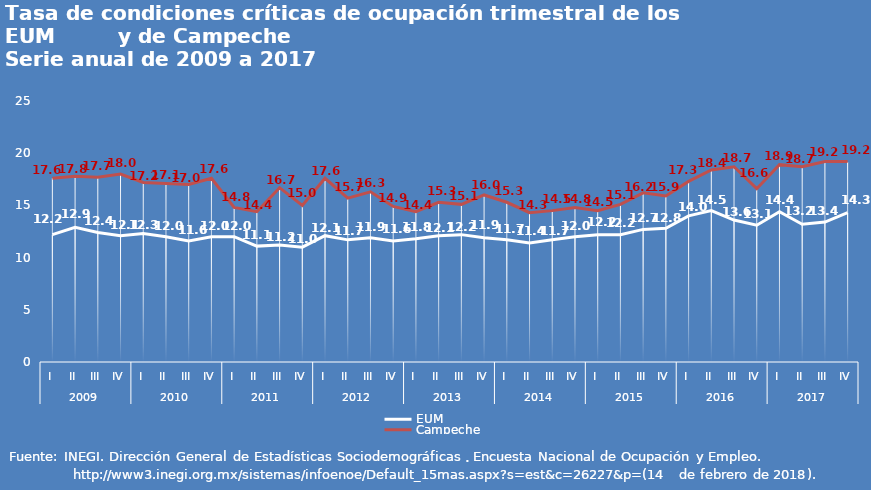
| Category | EUM | Campeche |
|---|---|---|
| 0 | 12.2 | 17.6 |
| 1 | 12.9 | 17.8 |
| 2 | 12.4 | 17.7 |
| 3 | 12.1 | 18 |
| 4 | 12.3 | 17.2 |
| 5 | 12 | 17.1 |
| 6 | 11.6 | 17 |
| 7 | 12 | 17.6 |
| 8 | 12 | 14.8 |
| 9 | 11.1 | 14.4 |
| 10 | 11.2 | 16.7 |
| 11 | 11 | 15 |
| 12 | 12.1 | 17.6 |
| 13 | 11.7 | 15.7 |
| 14 | 11.9 | 16.3 |
| 15 | 11.6 | 14.9 |
| 16 | 11.8 | 14.4 |
| 17 | 12.1 | 15.3 |
| 18 | 12.2 | 15.1 |
| 19 | 11.9 | 16 |
| 20 | 11.7 | 15.3 |
| 21 | 11.4 | 14.3 |
| 22 | 11.7 | 14.5 |
| 23 | 12 | 14.8 |
| 24 | 12.2 | 14.5 |
| 25 | 12.2 | 15.1 |
| 26 | 12.7 | 16.2 |
| 27 | 12.8 | 15.9 |
| 28 | 14 | 17.3 |
| 29 | 14.5 | 18.4 |
| 30 | 13.6 | 18.7 |
| 31 | 13.1 | 16.6 |
| 32 | 14.4 | 18.9 |
| 33 | 13.2 | 18.7 |
| 34 | 13.4 | 19.2 |
| 35 | 14.3 | 19.2 |